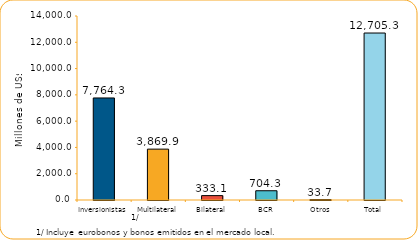
| Category | Series 1 |
|---|---|
| Inversionistas | 7764.3 |
| Multilateral | 3869.9 |
| Bilateral | 333.1 |
| BCR | 704.3 |
| Otros | 33.7 |
| Total | 12705.3 |